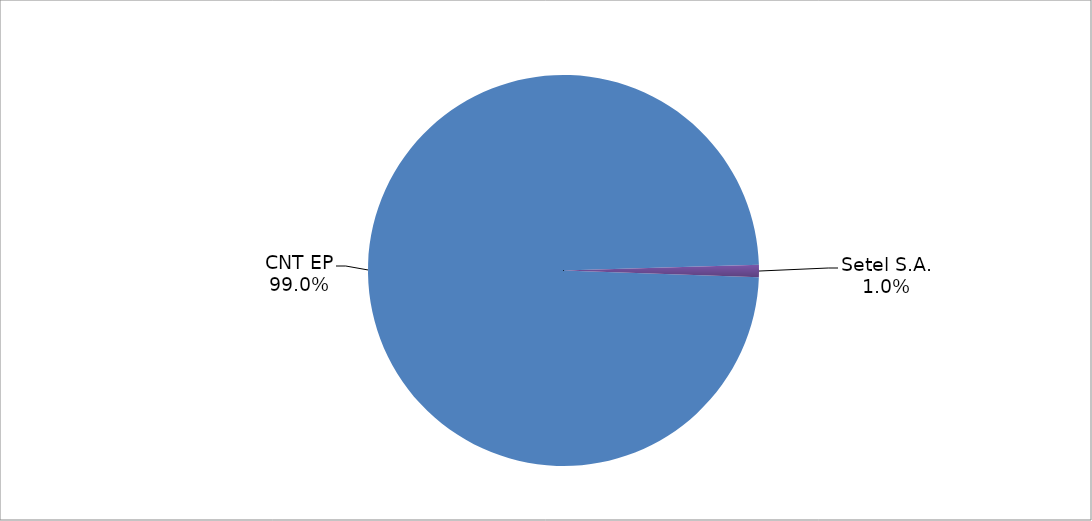
| Category | Series 0 |
|---|---|
| CNT EP | 290 |
| Setel S.A. | 3 |